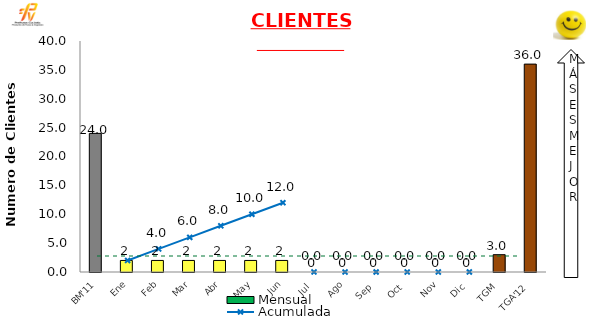
| Category | Mensual |
|---|---|
| BM'11 | 24 |
| Ene | 2 |
| Feb | 2 |
| Mar | 2 |
| Abr | 2 |
| May | 2 |
| Jun | 2 |
| Jul | 0 |
| Ago | 0 |
| Sep | 0 |
| Oct | 0 |
| Nov | 0 |
| Dic | 0 |
| TGM | 3 |
| TGA'12 | 36 |